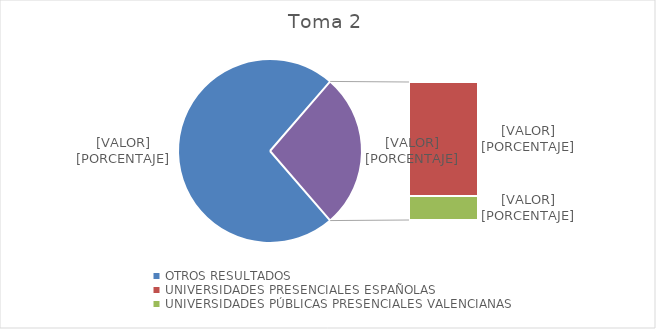
| Category | Series 0 |
|---|---|
| OTROS RESULTADOS | 4217 |
| UNIVERSIDADES PRESENCIALES ESPAÑOLAS  | 1308 |
| UNIVERSIDADES PÚBLICAS PRESENCIALES VALENCIANAS | 275 |